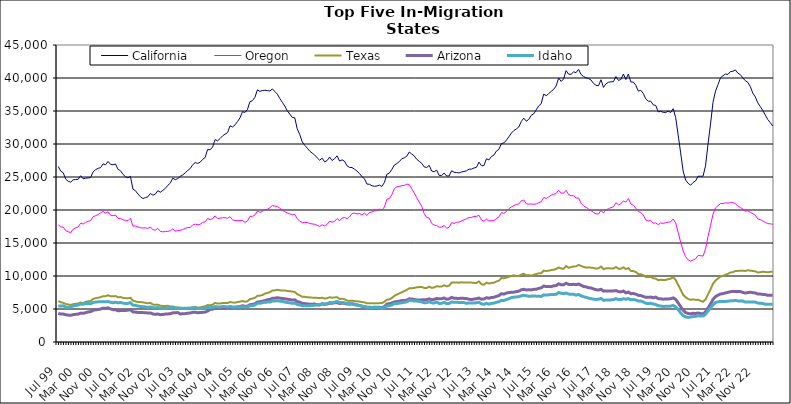
| Category | California | Oregon | Texas | Arizona | Idaho |
|---|---|---|---|---|---|
| Jul 99 | 26605 | 17749 | 6209 | 4339 | 5471 |
| Aug 99 | 25882 | 17447 | 6022 | 4228 | 5444 |
| Sep 99 | 25644 | 17401 | 5941 | 4237 | 5488 |
| Oct 99 | 24669 | 16875 | 5751 | 4134 | 5279 |
| Nov 99 | 24353 | 16701 | 5680 | 4073 | 5260 |
| Dec 99 | 24218 | 16570 | 5619 | 4042 | 5269 |
| Jan 00 | 24574 | 17109 | 5736 | 4142 | 5485 |
| Feb 00 | 24620 | 17295 | 5789 | 4192 | 5530 |
| Mar 00 | 24655 | 17436 | 5826 | 4226 | 5590 |
| Apr 00 | 25195 | 18009 | 5980 | 4375 | 5748 |
| May 00 | 24730 | 17875 | 5897 | 4337 | 5729 |
| Jun 00 | 24825 | 18113 | 6070 | 4444 | 5853 |
| Jul 00 | 24857 | 18294 | 6163 | 4555 | 5824 |
| Aug 00 | 24913 | 18376 | 6199 | 4603 | 5788 |
| Sep 00 | 25792 | 18971 | 6529 | 4804 | 5976 |
| Oct 00 | 26106 | 19135 | 6643 | 4870 | 6058 |
| Nov 00 | 26315 | 19306 | 6705 | 4926 | 6085 |
| Dec 00 | 26415 | 19570 | 6793 | 4991 | 6096 |
| Jan 01 | 26995 | 19781 | 6942 | 5122 | 6119 |
| Feb 01 | 26851 | 19519 | 6948 | 5089 | 6090 |
| Mar 01 | 27352 | 19720 | 7080 | 5180 | 6143 |
| Apr 01 | 26918 | 19221 | 6943 | 5020 | 6020 |
| May 01 | 26848 | 19126 | 6924 | 4899 | 5950 |
| Jun 01 | 26974 | 19241 | 6959 | 4895 | 6019 |
| Jul 01 | 26172 | 18725 | 6778 | 4737 | 5951 |
| Aug 01 | 25943 | 18736 | 6810 | 4757 | 5973 |
| Sep 01 | 25399 | 18514 | 6688 | 4753 | 5895 |
| Oct 01 | 25050 | 18415 | 6650 | 4780 | 5833 |
| Nov 01 | 24873 | 18381 | 6631 | 4826 | 5850 |
| Dec 01 | 25099 | 18765 | 6708 | 4898 | 5969 |
| Jan 02 | 23158 | 17561 | 6261 | 4560 | 5595 |
| Feb 02 | 22926 | 17573 | 6162 | 4531 | 5560 |
| Mar 02 | 22433 | 17452 | 6052 | 4481 | 5458 |
| Apr 02 | 22012 | 17314 | 6046 | 4458 | 5380 |
| May 02 | 21733 | 17267 | 6007 | 4452 | 5358 |
| Jun 02 | 21876 | 17298 | 5933 | 4444 | 5315 |
| Jul 02 | 21997 | 17209 | 5873 | 4383 | 5243 |
| Aug 02 | 22507 | 17436 | 5929 | 4407 | 5315 |
| Sep 02 | 22244 | 17010 | 5672 | 4248 | 5192 |
| Oct 02 | 22406 | 16952 | 5625 | 4191 | 5167 |
| Nov 02 | 22922 | 17223 | 5663 | 4242 | 5221 |
| Dec 02 | 22693 | 16770 | 5499 | 4142 | 5120 |
| Jan 03 | 22964 | 16694 | 5463 | 4166 | 5089 |
| Feb 03 | 23276 | 16727 | 5461 | 4226 | 5077 |
| Mar 03 | 23736 | 16766 | 5486 | 4251 | 5145 |
| Apr 03 | 24079 | 16859 | 5389 | 4289 | 5145 |
| May 03 | 24821 | 17117 | 5378 | 4415 | 5254 |
| Jun 03 | 24592 | 16812 | 5273 | 4426 | 5135 |
| Jul 03 | 24754 | 16875 | 5226 | 4466 | 5124 |
| Aug 03 | 25092 | 16922 | 5181 | 4244 | 5100 |
| Sep 03 | 25316 | 17036 | 5181 | 4279 | 5086 |
| Oct 03 | 25622 | 17228 | 5139 | 4301 | 5110 |
| Nov 03 | 25984 | 17335 | 5175 | 4362 | 5091 |
| Dec 03 | 26269 | 17350 | 5189 | 4396 | 5113 |
| Jan 04 | 26852 | 17734 | 5255 | 4492 | 5152 |
| Feb 04 | 27184 | 17860 | 5301 | 4502 | 5183 |
| Mar 04 | 27062 | 17757 | 5227 | 4443 | 5056 |
| Apr 04 | 27238 | 17840 | 5227 | 4461 | 5104 |
| May 04 | 27671 | 18113 | 5345 | 4493 | 5095 |
| Jun 04 | 27949 | 18201 | 5416 | 4532 | 5103 |
| Jul 04 | 29172 | 18727 | 5597 | 4697 | 5231 |
| Aug 04 | 29122 | 18529 | 5561 | 4945 | 5197 |
| Sep 04 | 29542 | 18678 | 5656 | 4976 | 5237 |
| Oct 04 | 30674 | 19108 | 5922 | 5188 | 5363 |
| Nov 04 | 30472 | 18716 | 5823 | 5106 | 5321 |
| Dec 04 | 30831 | 18755 | 5838 | 5135 | 5312 |
| Jan 05 | 31224 | 18823 | 5906 | 5155 | 5374 |
| Feb 05 | 31495 | 18842 | 5898 | 5168 | 5357 |
| Mar 05 | 31714 | 18738 | 5894 | 5212 | 5313 |
| Apr 05 | 32750 | 18998 | 6060 | 5340 | 5350 |
| May 05 | 32575 | 18504 | 5989 | 5269 | 5276 |
| Jun 05 | 32898 | 18414 | 5954 | 5252 | 5271 |
| Jul 05 | 33384 | 18395 | 6062 | 5322 | 5322 |
| Aug 05 | 33964 | 18381 | 6113 | 5375 | 5316 |
| Sep 05 | 34897 | 18426 | 6206 | 5493 | 5362 |
| Oct 05 | 34780 | 18132 | 6100 | 5408 | 5308 |
| Nov 05 | 35223 | 18332 | 6162 | 5434 | 5314 |
| Dec 05 | 36415 | 19047 | 6508 | 5658 | 5487 |
| Jan 06 | 36567 | 19032 | 6576 | 5688 | 5480 |
| Feb 06 | 37074 | 19257 | 6692 | 5792 | 5616 |
| Mar 06 | 38207 | 19845 | 6993 | 6052 | 5850 |
| Apr 06 | 37976 | 19637 | 7024 | 6101 | 5864 |
| May 06 | 38099 | 19781 | 7114 | 6178 | 5943 |
| Jun 06 | 38141 | 20061 | 7331 | 6276 | 6018 |
| Jul 06 | 38097 | 20111 | 7431 | 6399 | 6046 |
| Aug 06 | 38021 | 20333 | 7542 | 6450 | 6064 |
| Sep 06 | 38349 | 20686 | 7798 | 6627 | 6232 |
| Oct 06 | 37947 | 20591 | 7825 | 6647 | 6216 |
| Nov 06 | 37565 | 20526 | 7907 | 6707 | 6244 |
| Dec 06 | 36884 | 20272 | 7840 | 6648 | 6192 |
| Jan 07 | 36321 | 19984 | 7789 | 6597 | 6151 |
| Feb 07 | 35752 | 19752 | 7799 | 6554 | 6048 |
| Mar 07 | 35025 | 19547 | 7737 | 6487 | 5989 |
| Apr 07 | 34534 | 19412 | 7685 | 6430 | 5937 |
| May 07 | 34022 | 19296 | 7654 | 6353 | 5858 |
| Jun 07 | 33974 | 19318 | 7577 | 6390 | 5886 |
| Jul 07 | 32298 | 18677 | 7250 | 6117 | 5682 |
| Aug 07 | 31436 | 18322 | 7070 | 6034 | 5617 |
| Sep 07 | 30331 | 18087 | 6853 | 5847 | 5500 |
| Oct 07 | 29813 | 18108 | 6839 | 5821 | 5489 |
| Nov 07 | 29384 | 18105 | 6777 | 5769 | 5481 |
| Dec 07 | 28923 | 17949 | 6760 | 5733 | 5499 |
| Jan 08 | 28627 | 17890 | 6721 | 5732 | 5521 |
| Feb 08 | 28328 | 17834 | 6719 | 5749 | 5579 |
| Mar 08 | 27911 | 17680 | 6690 | 5650 | 5614 |
| Apr 08 | 27543 | 17512 | 6656 | 5612 | 5635 |
| May 08 | 27856 | 17754 | 6705 | 5774 | 5798 |
| Jun 08 | 27287 | 17589 | 6593 | 5717 | 5745 |
| Jul 08 | 27495 | 17834 | 6623 | 5761 | 5807 |
| Aug 08 | 28018 | 18309 | 6789 | 5867 | 5982 |
| Sep-08 | 27491 | 18164 | 6708 | 5864 | 5954 |
| Oct 08 | 27771 | 18291 | 6755 | 5942 | 6032 |
| Nov 08 | 28206 | 18706 | 6787 | 5970 | 6150 |
| Dec 08 | 27408 | 18353 | 6505 | 5832 | 5975 |
| Jan 09 | 27601 | 18778 | 6569 | 5890 | 5995 |
| Feb 09 | 27394 | 18863 | 6483 | 5845 | 5936 |
| Mar 09 | 26690 | 18694 | 6273 | 5751 | 5806 |
| Apr 09 | 26461 | 18943 | 6222 | 5735 | 5777 |
| May 09 | 26435 | 19470 | 6272 | 5819 | 5767 |
| Jun 09 | 26187 | 19522 | 6199 | 5700 | 5649 |
| Jul 09 | 25906 | 19408 | 6171 | 5603 | 5617 |
| Aug 09 | 25525 | 19469 | 6128 | 5533 | 5540 |
| Sep 09 | 25050 | 19249 | 6059 | 5405 | 5437 |
| Oct 09 | 24741 | 19529 | 6004 | 5349 | 5369 |
| Nov 09 | 23928 | 19187 | 5854 | 5271 | 5248 |
| Dec 09 | 23899 | 19607 | 5886 | 5261 | 5195 |
| Jan 10 | 23676 | 19703 | 5881 | 5232 | 5234 |
| Feb 10 | 23592 | 19845 | 5850 | 5272 | 5236 |
| Mar 10 | 23634 | 19946 | 5864 | 5278 | 5219 |
| Apr 10 | 23774 | 20134 | 5889 | 5257 | 5201 |
| May 10 | 23567 | 19966 | 5897 | 5172 | 5105 |
| Jun 10 | 24166 | 20464 | 6087 | 5356 | 5237 |
| Jul 10 | 25410 | 21627 | 6417 | 5742 | 5452 |
| Aug 10 | 25586 | 21744 | 6465 | 5797 | 5491 |
| Sep 10 | 26150 | 22314 | 6667 | 5907 | 5609 |
| Oct 10 | 26807 | 23219 | 6986 | 6070 | 5831 |
| Nov 10 | 27033 | 23520 | 7179 | 6100 | 5810 |
| Dec 10 | 27332 | 23551 | 7361 | 6182 | 5898 |
| Jan 11 | 27769 | 23697 | 7525 | 6276 | 5938 |
| Feb 11 | 27898 | 23718 | 7708 | 6267 | 6016 |
| Mar 11 | 28155 | 23921 | 7890 | 6330 | 6081 |
| Apr 11 | 28790 | 23847 | 8146 | 6544 | 6305 |
| May 11 | 28471 | 23215 | 8131 | 6502 | 6248 |
| Jun 11 | 28191 | 22580 | 8199 | 6445 | 6217 |
| Jul 11 | 27678 | 21867 | 8291 | 6368 | 6202 |
| Aug 11 | 27372 | 21203 | 8321 | 6356 | 6146 |
| Sep 11 | 27082 | 20570 | 8341 | 6387 | 6075 |
| Oct 11 | 26528 | 19442 | 8191 | 6402 | 5932 |
| Nov 11 | 26440 | 18872 | 8176 | 6426 | 5968 |
| Dec 11 | 26770 | 18784 | 8401 | 6533 | 6106 |
| Jan 12 | 25901 | 17963 | 8202 | 6390 | 5933 |
| Feb 12 | 25796 | 17718 | 8266 | 6456 | 5900 |
| Mar 12 | 26042 | 17647 | 8456 | 6600 | 6054 |
| Apr 12 | 25239 | 17386 | 8388 | 6534 | 5838 |
| May 12 | 25238 | 17407 | 8401 | 6558 | 5854 |
| Jun 12 | 25593 | 17673 | 8594 | 6669 | 6009 |
| Jul 12 | 25155 | 17237 | 8432 | 6474 | 5817 |
| Aug 12 | 25146 | 17391 | 8536 | 6539 | 5842 |
| Sep 12 | 25942 | 18102 | 8989 | 6759 | 6061 |
| Oct 12 | 25718 | 17953 | 9012 | 6618 | 6027 |
| Nov 12 | 25677 | 18134 | 9032 | 6611 | 6009 |
| Dec 12 | 25619 | 18166 | 8981 | 6601 | 5999 |
| Jan 13 | 25757 | 18344 | 9051 | 6627 | 5989 |
| Feb-13 | 25830 | 18512 | 9001 | 6606 | 5968 |
| Mar-13 | 25940 | 18689 | 9021 | 6577 | 5853 |
| Apr 13 | 26187 | 18844 | 9013 | 6478 | 5925 |
| May 13 | 26192 | 18884 | 9003 | 6431 | 5924 |
| Jun-13 | 26362 | 19013 | 8948 | 6508 | 5896 |
| Jul 13 | 26467 | 19037 | 8958 | 6559 | 5948 |
| Aug 13 | 27253 | 19198 | 9174 | 6655 | 6020 |
| Sep 13 | 26711 | 18501 | 8747 | 6489 | 5775 |
| Oct 13 | 26733 | 18301 | 8681 | 6511 | 5711 |
| Nov 13 | 27767 | 18620 | 8989 | 6709 | 5860 |
| Dec 13 | 27583 | 18320 | 8863 | 6637 | 5740 |
| Jan 14 | 28107 | 18409 | 8939 | 6735 | 5843 |
| Feb-14 | 28313 | 18383 | 8989 | 6779 | 5893 |
| Mar 14 | 28934 | 18696 | 9160 | 6918 | 6015 |
| Apr 14 | 29192 | 18946 | 9291 | 7036 | 6099 |
| May 14 | 30069 | 19603 | 9701 | 7314 | 6304 |
| Jun 14 | 30163 | 19487 | 9641 | 7252 | 6293 |
| Jul-14 | 30587 | 19754 | 9752 | 7415 | 6427 |
| Aug-14 | 31074 | 20201 | 9882 | 7499 | 6557 |
| Sep 14 | 31656 | 20459 | 9997 | 7536 | 6719 |
| Oct 14 | 32037 | 20663 | 10109 | 7555 | 6786 |
| Nov 14 | 32278 | 20825 | 9992 | 7628 | 6831 |
| Dec 14 | 32578 | 20918 | 10006 | 7705 | 6860 |
| Jan 15 | 33414 | 21396 | 10213 | 7906 | 7000 |
| Feb 15 | 33922 | 21518 | 10337 | 7982 | 7083 |
| Mar 15 | 33447 | 20942 | 10122 | 7891 | 7006 |
| Apr-15 | 33731 | 20893 | 10138 | 7906 | 6931 |
| May 15 | 34343 | 20902 | 10053 | 7895 | 6952 |
| Jun-15 | 34572 | 20870 | 10192 | 7973 | 6966 |
| Jul 15 | 35185 | 20916 | 10303 | 8000 | 6949 |
| Aug 15 | 35780 | 21115 | 10399 | 8126 | 6938 |
| Sep 15 | 36109 | 21246 | 10428 | 8207 | 6896 |
| Oct 15 | 37555 | 21908 | 10813 | 8477 | 7140 |
| Nov 15 | 37319 | 21750 | 10763 | 8390 | 7112 |
| Dec 15 | 37624 | 21990 | 10807 | 8395 | 7149 |
| Jan 16 | 37978 | 22248 | 10892 | 8388 | 7201 |
| Feb 16 | 38285 | 22369 | 10951 | 8508 | 7192 |
| Mar 16 | 38792 | 22506 | 11075 | 8547 | 7226 |
| Apr 16 | 39994 | 22999 | 11286 | 8815 | 7487 |
| May 16 | 39488 | 22548 | 11132 | 8673 | 7382 |
| Jun 16 | 39864 | 22556 | 11100 | 8682 | 7315 |
| Jul 16 | 41123 | 22989 | 11516 | 8903 | 7420 |
| Aug 16 | 40573 | 22333 | 11251 | 8731 | 7261 |
| Sep 16 | 40560 | 22162 | 11340 | 8692 | 7216 |
| Oct 16 | 40923 | 22172 | 11456 | 8742 | 7233 |
| Nov 16 | 40817 | 21818 | 11459 | 8685 | 7101 |
| Dec 16 | 41311 | 21815 | 11681 | 8783 | 7203 |
| Jan 17 | 40543 | 21029 | 11524 | 8609 | 6982 |
| Feb 17 | 40218 | 20613 | 11385 | 8416 | 6852 |
| Mar 17 | 40052 | 20425 | 11276 | 8354 | 6775 |
| Apr 17 | 39913 | 20147 | 11297 | 8218 | 6653 |
| May 17 | 39695 | 19910 | 11265 | 8196 | 6552 |
| Jun 17 | 39177 | 19650 | 11225 | 8034 | 6500 |
| Jul 17 | 38901 | 19419 | 11115 | 7923 | 6429 |
| Aug 17 | 38827 | 19389 | 11168 | 7867 | 6479 |
| Sep 17 | 39736 | 19936 | 11426 | 7991 | 6609 |
| Oct 17 | 38576 | 19547 | 11041 | 7708 | 6315 |
| Nov 17 | 39108 | 20013 | 11158 | 7746 | 6381 |
| Dec 17 | 39359 | 20202 | 11185 | 7743 | 6366 |
| Jan 18 | 39420 | 20362 | 11118 | 7736 | 6380 |
| Feb 18 | 39440 | 20476 | 11128 | 7741 | 6407 |
| Mar 18 | 40218 | 21106 | 11362 | 7789 | 6578 |
| Apr 18 | 39637 | 20788 | 11111 | 7642 | 6423 |
| May 18 | 39777 | 20933 | 11097 | 7591 | 6430 |
| Jun 18 | 40602 | 21381 | 11317 | 7721 | 6554 |
| Jul 18 | 39767 | 21189 | 11038 | 7445 | 6489 |
| Aug 18 | 40608 | 21729 | 11200 | 7560 | 6569 |
| Sep 18 | 39395 | 20916 | 10772 | 7318 | 6383 |
| Oct 18 | 39383 | 20724 | 10740 | 7344 | 6429 |
| Nov 18 | 38891 | 20265 | 10605 | 7255 | 6365 |
| Dec 18 | 38013 | 19741 | 10292 | 7069 | 6205 |
| Jan 19 | 38130 | 19643 | 10261 | 7032 | 6203 |
| Feb 19 | 37658 | 19237 | 10132 | 6892 | 6073 |
| Mar 19 | 36831 | 18492 | 9848 | 6766 | 5863 |
| Apr 19 | 36492 | 18349 | 9839 | 6763 | 5827 |
| May 19 | 36481 | 18407 | 9867 | 6809 | 5873 |
| Jun 19 | 35925 | 17998 | 9661 | 6698 | 5761 |
| Jul 19 | 35843 | 18049 | 9598 | 6800 | 5673 |
| Aug 19 | 34870 | 17785 | 9361 | 6577 | 5512 |
| Sep 19 | 34945 | 18038 | 9428 | 6547 | 5437 |
| Oct 19 | 34802 | 17977 | 9385 | 6483 | 5390 |
| Nov 19 | 34775 | 18072 | 9403 | 6511 | 5401 |
| Dec 19 | 34976 | 18140 | 9518 | 6521 | 5419 |
| Jan 20 | 34774 | 18209 | 9594 | 6561 | 5434 |
| Feb 20 | 35352 | 18632 | 9804 | 6682 | 5543 |
| Mar 20 | 34013 | 18041 | 9411 | 6464 | 5330 |
| Apr 20 | 31385 | 16629 | 8666 | 5922 | 4906 |
| May 20 | 28657 | 15123 | 7927 | 5355 | 4419 |
| Jun 20 | 25915 | 13817 | 7164 | 4815 | 3992 |
| Jul 20 | 24545 | 12926 | 6776 | 4457 | 3810 |
| Aug 20 | 24048 | 12443 | 6521 | 4326 | 3720 |
| Sep 20 | 23756 | 12258 | 6386 | 4266 | 3784 |
| Oct 20 | 24166 | 12429 | 6452 | 4347 | 3861 |
| Nov 20 | 24404 | 12597 | 6386 | 4324 | 3883 |
| Dec 20 | 25120 | 13122 | 6420 | 4394 | 3974 |
| Jan 21 | 25111 | 13080 | 6236 | 4304 | 3924 |
| Feb 21 | 25114 | 13015 | 6094 | 4260 | 3930 |
| Mar 21 | 26701 | 14096 | 6455 | 4567 | 4185 |
| Apr 21 | 29998 | 15978 | 7222 | 5164 | 4697 |
| May 21 | 33020 | 17641 | 7969 | 5748 | 5148 |
| Jun 21 | 36320 | 19369 | 8840 | 6450 | 5628 |
| Jul 21 | 37989 | 20320 | 9306 | 6877 | 5984 |
| Aug 21 | 39007 | 20657 | 9615 | 7094 | 6084 |
| Sep 21 | 40023 | 20974 | 9914 | 7277 | 6151 |
| Oct 21 | 40348 | 20966 | 10003 | 7327 | 6140 |
| Nov 21 | 40599 | 21096 | 10203 | 7437 | 6136 |
| Dec 21 | 40548 | 21032 | 10328 | 7532 | 6183 |
| Jan 22 | 40967 | 21106 | 10535 | 7618 | 6237 |
| Feb 22 | 41019 | 21125 | 10579 | 7673 | 6236 |
| Mar 22 | 41220 | 20949 | 10751 | 7660 | 6310 |
| Apr 22 | 40730 | 20602 | 10772 | 7661 | 6221 |
| May 22 | 40504 | 20370 | 10792 | 7636 | 6210 |
| Jun 22 | 40013 | 20127 | 10802 | 7504 | 6199 |
| Jul 22 | 39582 | 19846 | 10761 | 7419 | 6050 |
| Aug 22 | 39321 | 19865 | 10868 | 7487 | 6071 |
| Sep 22 | 38685 | 19666 | 10811 | 7536 | 6074 |
| Oct 22 | 37700 | 19450 | 10764 | 7469 | 6042 |
| Nov 22 | 37133 | 19198 | 10701 | 7425 | 6042 |
| Dec 22 | 36232 | 18659 | 10527 | 7261 | 5898 |
| Jan 23 | 35674 | 18528 | 10578 | 7263 | 5879 |
| Feb 23 | 35072 | 18344 | 10642 | 7211 | 5827 |
| Mar 23 | 34396 | 18133 | 10609 | 7183 | 5713 |
| Apr 23 | 33708 | 17931 | 10559 | 7074 | 5706 |
| May 23 | 33245 | 17904 | 10624 | 7091 | 5712 |
| Jun 23 | 32727 | 17831 | 10663 | 7105 | 5726 |